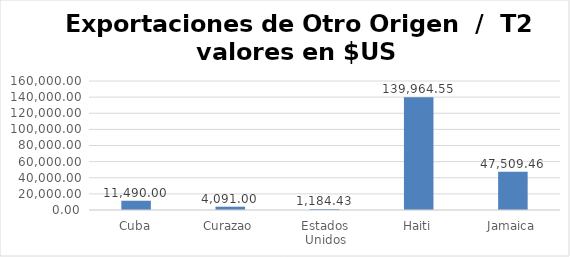
| Category | Valor US  |
|---|---|
| Cuba | 11490 |
| Curazao | 4091 |
| Estados Unidos | 1184.43 |
| Haiti | 139964.547 |
| Jamaica | 47509.46 |